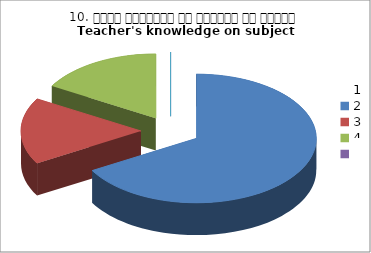
| Category | 10. विषय अवधारणा पर शिक्षक का ज्ञान
Teacher's knowledge on subject concept?
 |
|---|---|
| 0 | 4 |
| 1 | 1 |
| 2 | 1 |
| 3 | 0 |
| 4 | 0 |